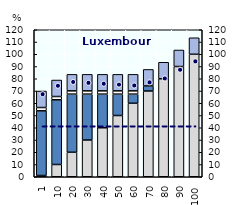
| Category | Gross earnings | Social assistance | Housing benefits | Family benefits | In-work benefits |
|---|---|---|---|---|---|
| 1.0 | 1.001 | 52.847 | 2.662 | 13.466 | 0 |
| 10.0 | 10 | 52.847 | 2.662 | 13.466 | 0 |
| 20.0 | 20.001 | 47.46 | 2.662 | 13.466 | 0 |
| 30.0 | 29.999 | 37.459 | 2.662 | 13.466 | 0 |
| 40.0 | 40 | 27.459 | 2.662 | 13.466 | 0 |
| 50.0 | 50 | 17.459 | 2.662 | 13.466 | 0 |
| 60.0 | 60 | 7.458 | 2.662 | 13.466 | 0 |
| 70.0 | 70.001 | 4.135 | 0 | 13.466 | 0 |
| 80.0 | 79.999 | 0 | 0 | 13.466 | 0 |
| 90.0 | 90 | 0 | 0 | 13.466 | 0 |
| 100.0 | 100 | 0 | 0 | 13.466 | 0 |